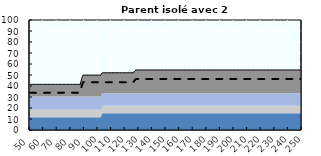
| Category | Coin fiscal marginal (somme des composantes) | Taux d’imposition marginal net |
|---|---|---|
| 50.0 | 41.504 | 33.9 |
| 51.0 | 41.504 | 33.9 |
| 52.0 | 41.504 | 33.9 |
| 53.0 | 41.504 | 33.9 |
| 54.0 | 41.504 | 33.9 |
| 55.0 | 41.504 | 33.9 |
| 56.0 | 41.504 | 33.9 |
| 57.0 | 41.504 | 33.9 |
| 58.0 | 41.504 | 33.9 |
| 59.0 | 41.504 | 33.9 |
| 60.0 | 41.504 | 33.9 |
| 61.0 | 41.504 | 33.9 |
| 62.0 | 41.504 | 33.9 |
| 63.0 | 41.504 | 33.9 |
| 64.0 | 41.504 | 33.9 |
| 65.0 | 41.504 | 33.9 |
| 66.0 | 41.504 | 33.9 |
| 67.0 | 41.504 | 33.9 |
| 68.0 | 41.504 | 33.9 |
| 69.0 | 41.504 | 33.9 |
| 70.0 | 41.504 | 33.9 |
| 71.0 | 41.504 | 33.9 |
| 72.0 | 41.504 | 33.9 |
| 73.0 | 41.504 | 33.9 |
| 74.0 | 41.504 | 33.9 |
| 75.0 | 41.504 | 33.9 |
| 76.0 | 41.504 | 33.9 |
| 77.0 | 41.504 | 33.9 |
| 78.0 | 41.504 | 33.9 |
| 79.0 | 41.504 | 33.9 |
| 80.0 | 41.504 | 33.9 |
| 81.0 | 41.504 | 33.9 |
| 82.0 | 41.504 | 33.9 |
| 83.0 | 41.504 | 33.9 |
| 84.0 | 41.504 | 33.9 |
| 85.0 | 41.504 | 33.9 |
| 86.0 | 41.504 | 33.9 |
| 87.0 | 41.504 | 33.9 |
| 88.0 | 46.919 | 40.018 |
| 89.0 | 49.912 | 43.4 |
| 90.0 | 49.912 | 43.4 |
| 91.0 | 49.912 | 43.4 |
| 92.0 | 49.912 | 43.4 |
| 93.0 | 49.912 | 43.4 |
| 94.0 | 49.912 | 43.4 |
| 95.0 | 49.912 | 43.4 |
| 96.0 | 49.912 | 43.4 |
| 97.0 | 49.912 | 43.4 |
| 98.0 | 49.912 | 43.4 |
| 99.0 | 49.912 | 43.4 |
| 100.0 | 49.912 | 43.4 |
| 101.0 | 49.912 | 43.4 |
| 102.0 | 49.912 | 43.4 |
| 103.0 | 51.897 | 43.4 |
| 104.0 | 52.034 | 43.4 |
| 105.0 | 52.034 | 43.4 |
| 106.0 | 52.034 | 43.4 |
| 107.0 | 52.034 | 43.4 |
| 108.0 | 52.034 | 43.4 |
| 109.0 | 52.034 | 43.4 |
| 110.0 | 52.034 | 43.4 |
| 111.0 | 52.034 | 43.4 |
| 112.0 | 52.034 | 43.4 |
| 113.0 | 52.034 | 43.4 |
| 114.0 | 52.034 | 43.4 |
| 115.0 | 52.034 | 43.4 |
| 116.0 | 52.034 | 43.4 |
| 117.0 | 52.034 | 43.4 |
| 118.0 | 52.034 | 43.4 |
| 119.0 | 52.034 | 43.4 |
| 120.0 | 52.034 | 43.4 |
| 121.0 | 52.034 | 43.4 |
| 122.0 | 52.034 | 43.4 |
| 123.0 | 52.034 | 43.4 |
| 124.0 | 52.034 | 43.4 |
| 125.0 | 52.034 | 43.4 |
| 126.0 | 52.034 | 43.4 |
| 127.0 | 53.652 | 45.31 |
| 128.0 | 54.576 | 46.4 |
| 129.0 | 54.576 | 46.4 |
| 130.0 | 54.576 | 46.4 |
| 131.0 | 54.576 | 46.4 |
| 132.0 | 54.576 | 46.4 |
| 133.0 | 54.576 | 46.4 |
| 134.0 | 54.576 | 46.4 |
| 135.0 | 54.576 | 46.4 |
| 136.0 | 54.576 | 46.4 |
| 137.0 | 54.576 | 46.4 |
| 138.0 | 54.576 | 46.4 |
| 139.0 | 54.576 | 46.4 |
| 140.0 | 54.576 | 46.4 |
| 141.0 | 54.576 | 46.4 |
| 142.0 | 54.576 | 46.4 |
| 143.0 | 54.576 | 46.4 |
| 144.0 | 54.576 | 46.4 |
| 145.0 | 54.576 | 46.4 |
| 146.0 | 54.576 | 46.4 |
| 147.0 | 54.576 | 46.4 |
| 148.0 | 54.576 | 46.4 |
| 149.0 | 54.576 | 46.4 |
| 150.0 | 54.576 | 46.4 |
| 151.0 | 54.576 | 46.4 |
| 152.0 | 54.576 | 46.4 |
| 153.0 | 54.576 | 46.4 |
| 154.0 | 54.576 | 46.4 |
| 155.0 | 54.576 | 46.4 |
| 156.0 | 54.576 | 46.4 |
| 157.0 | 54.576 | 46.4 |
| 158.0 | 54.576 | 46.4 |
| 159.0 | 54.576 | 46.4 |
| 160.0 | 54.576 | 46.4 |
| 161.0 | 54.576 | 46.4 |
| 162.0 | 54.576 | 46.4 |
| 163.0 | 54.576 | 46.4 |
| 164.0 | 54.576 | 46.4 |
| 165.0 | 54.576 | 46.4 |
| 166.0 | 54.576 | 46.4 |
| 167.0 | 54.576 | 46.4 |
| 168.0 | 54.576 | 46.4 |
| 169.0 | 54.576 | 46.4 |
| 170.0 | 54.576 | 46.4 |
| 171.0 | 54.576 | 46.4 |
| 172.0 | 54.576 | 46.4 |
| 173.0 | 54.576 | 46.4 |
| 174.0 | 54.576 | 46.4 |
| 175.0 | 54.576 | 46.4 |
| 176.0 | 54.576 | 46.4 |
| 177.0 | 54.576 | 46.4 |
| 178.0 | 54.576 | 46.4 |
| 179.0 | 54.576 | 46.4 |
| 180.0 | 54.576 | 46.4 |
| 181.0 | 54.576 | 46.4 |
| 182.0 | 54.576 | 46.4 |
| 183.0 | 54.576 | 46.4 |
| 184.0 | 54.576 | 46.4 |
| 185.0 | 54.576 | 46.4 |
| 186.0 | 54.576 | 46.4 |
| 187.0 | 54.576 | 46.4 |
| 188.0 | 54.576 | 46.4 |
| 189.0 | 54.576 | 46.4 |
| 190.0 | 54.576 | 46.4 |
| 191.0 | 54.576 | 46.4 |
| 192.0 | 54.576 | 46.4 |
| 193.0 | 54.576 | 46.4 |
| 194.0 | 54.576 | 46.4 |
| 195.0 | 54.576 | 46.4 |
| 196.0 | 54.576 | 46.4 |
| 197.0 | 54.576 | 46.4 |
| 198.0 | 54.576 | 46.4 |
| 199.0 | 54.576 | 46.4 |
| 200.0 | 54.576 | 46.4 |
| 201.0 | 54.576 | 46.4 |
| 202.0 | 54.576 | 46.4 |
| 203.0 | 54.576 | 46.4 |
| 204.0 | 54.576 | 46.4 |
| 205.0 | 54.576 | 46.4 |
| 206.0 | 54.576 | 46.4 |
| 207.0 | 54.576 | 46.4 |
| 208.0 | 54.576 | 46.4 |
| 209.0 | 54.576 | 46.4 |
| 210.0 | 54.576 | 46.4 |
| 211.0 | 54.576 | 46.4 |
| 212.0 | 54.576 | 46.4 |
| 213.0 | 54.576 | 46.4 |
| 214.0 | 54.576 | 46.4 |
| 215.0 | 54.576 | 46.4 |
| 216.0 | 54.576 | 46.4 |
| 217.0 | 54.576 | 46.4 |
| 218.0 | 54.576 | 46.4 |
| 219.0 | 54.576 | 46.4 |
| 220.0 | 54.576 | 46.4 |
| 221.0 | 54.576 | 46.4 |
| 222.0 | 54.576 | 46.4 |
| 223.0 | 54.576 | 46.4 |
| 224.0 | 54.576 | 46.4 |
| 225.0 | 54.576 | 46.4 |
| 226.0 | 54.576 | 46.4 |
| 227.0 | 54.576 | 46.4 |
| 228.0 | 54.576 | 46.4 |
| 229.0 | 54.576 | 46.4 |
| 230.0 | 54.576 | 46.4 |
| 231.0 | 54.576 | 46.4 |
| 232.0 | 54.576 | 46.4 |
| 233.0 | 54.576 | 46.4 |
| 234.0 | 54.576 | 46.4 |
| 235.0 | 54.576 | 46.4 |
| 236.0 | 54.576 | 46.4 |
| 237.0 | 54.576 | 46.4 |
| 238.0 | 54.576 | 46.4 |
| 239.0 | 54.576 | 46.4 |
| 240.0 | 54.576 | 46.4 |
| 241.0 | 54.576 | 46.4 |
| 242.0 | 54.576 | 46.4 |
| 243.0 | 54.576 | 46.4 |
| 244.0 | 54.576 | 46.4 |
| 245.0 | 54.576 | 46.4 |
| 246.0 | 54.576 | 46.4 |
| 247.0 | 54.576 | 46.4 |
| 248.0 | 54.576 | 46.4 |
| 249.0 | 54.576 | 46.4 |
| 250.0 | 54.576 | 46.4 |